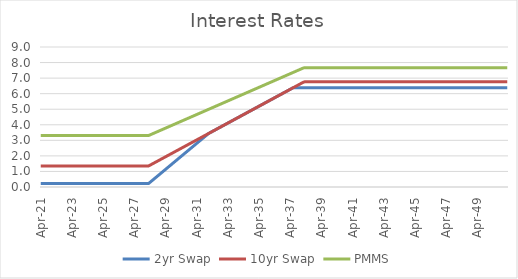
| Category | 2yr Swap | 10yr Swap | PMMS |
|---|---|---|---|
| 2021-04-30 | 0.223 | 1.352 | 3.308 |
| 2021-05-31 | 0.223 | 1.352 | 3.308 |
| 2021-06-30 | 0.223 | 1.352 | 3.308 |
| 2021-07-31 | 0.223 | 1.352 | 3.308 |
| 2021-08-31 | 0.223 | 1.352 | 3.308 |
| 2021-09-30 | 0.223 | 1.352 | 3.308 |
| 2021-10-31 | 0.223 | 1.352 | 3.308 |
| 2021-11-30 | 0.223 | 1.352 | 3.308 |
| 2021-12-31 | 0.223 | 1.352 | 3.308 |
| 2022-01-31 | 0.223 | 1.352 | 3.308 |
| 2022-02-28 | 0.223 | 1.352 | 3.308 |
| 2022-03-31 | 0.223 | 1.352 | 3.308 |
| 2022-04-30 | 0.223 | 1.352 | 3.308 |
| 2022-05-31 | 0.223 | 1.352 | 3.308 |
| 2022-06-30 | 0.223 | 1.352 | 3.308 |
| 2022-07-31 | 0.223 | 1.352 | 3.308 |
| 2022-08-31 | 0.223 | 1.352 | 3.308 |
| 2022-09-30 | 0.223 | 1.352 | 3.308 |
| 2022-10-31 | 0.223 | 1.352 | 3.308 |
| 2022-11-30 | 0.223 | 1.352 | 3.308 |
| 2022-12-31 | 0.223 | 1.352 | 3.308 |
| 2023-01-31 | 0.223 | 1.352 | 3.308 |
| 2023-02-28 | 0.223 | 1.352 | 3.308 |
| 2023-03-31 | 0.223 | 1.352 | 3.308 |
| 2023-04-30 | 0.223 | 1.352 | 3.308 |
| 2023-05-31 | 0.223 | 1.352 | 3.308 |
| 2023-06-30 | 0.223 | 1.352 | 3.308 |
| 2023-07-31 | 0.223 | 1.352 | 3.308 |
| 2023-08-31 | 0.223 | 1.352 | 3.308 |
| 2023-09-30 | 0.223 | 1.352 | 3.308 |
| 2023-10-31 | 0.223 | 1.352 | 3.308 |
| 2023-11-30 | 0.223 | 1.352 | 3.308 |
| 2023-12-31 | 0.223 | 1.352 | 3.308 |
| 2024-01-31 | 0.223 | 1.352 | 3.308 |
| 2024-02-29 | 0.223 | 1.352 | 3.308 |
| 2024-03-31 | 0.223 | 1.352 | 3.308 |
| 2024-04-30 | 0.223 | 1.352 | 3.308 |
| 2024-05-31 | 0.223 | 1.352 | 3.308 |
| 2024-06-30 | 0.223 | 1.352 | 3.308 |
| 2024-07-31 | 0.223 | 1.352 | 3.308 |
| 2024-08-31 | 0.223 | 1.352 | 3.308 |
| 2024-09-30 | 0.223 | 1.352 | 3.308 |
| 2024-10-31 | 0.223 | 1.352 | 3.308 |
| 2024-11-30 | 0.223 | 1.352 | 3.308 |
| 2024-12-31 | 0.223 | 1.352 | 3.308 |
| 2025-01-31 | 0.223 | 1.352 | 3.308 |
| 2025-02-28 | 0.223 | 1.352 | 3.308 |
| 2025-03-31 | 0.223 | 1.352 | 3.308 |
| 2025-04-30 | 0.223 | 1.352 | 3.308 |
| 2025-05-31 | 0.223 | 1.352 | 3.308 |
| 2025-06-30 | 0.223 | 1.352 | 3.308 |
| 2025-07-31 | 0.223 | 1.352 | 3.308 |
| 2025-08-31 | 0.223 | 1.352 | 3.308 |
| 2025-09-30 | 0.223 | 1.352 | 3.308 |
| 2025-10-31 | 0.223 | 1.352 | 3.308 |
| 2025-11-30 | 0.223 | 1.352 | 3.308 |
| 2025-12-31 | 0.223 | 1.352 | 3.308 |
| 2026-01-31 | 0.223 | 1.352 | 3.308 |
| 2026-02-28 | 0.223 | 1.352 | 3.308 |
| 2026-03-31 | 0.223 | 1.352 | 3.308 |
| 2026-04-30 | 0.223 | 1.352 | 3.308 |
| 2026-05-31 | 0.223 | 1.352 | 3.308 |
| 2026-06-30 | 0.223 | 1.352 | 3.308 |
| 2026-07-31 | 0.223 | 1.352 | 3.308 |
| 2026-08-31 | 0.223 | 1.352 | 3.308 |
| 2026-09-30 | 0.223 | 1.352 | 3.308 |
| 2026-10-31 | 0.223 | 1.352 | 3.308 |
| 2026-11-30 | 0.223 | 1.352 | 3.308 |
| 2026-12-31 | 0.223 | 1.352 | 3.308 |
| 2027-01-31 | 0.223 | 1.352 | 3.308 |
| 2027-02-28 | 0.223 | 1.352 | 3.308 |
| 2027-03-31 | 0.223 | 1.352 | 3.308 |
| 2027-04-30 | 0.223 | 1.352 | 3.308 |
| 2027-05-31 | 0.223 | 1.352 | 3.308 |
| 2027-06-30 | 0.223 | 1.352 | 3.308 |
| 2027-07-31 | 0.223 | 1.352 | 3.308 |
| 2027-08-31 | 0.223 | 1.352 | 3.308 |
| 2027-09-30 | 0.223 | 1.352 | 3.308 |
| 2027-10-31 | 0.223 | 1.352 | 3.308 |
| 2027-11-30 | 0.223 | 1.352 | 3.308 |
| 2027-12-31 | 0.223 | 1.352 | 3.308 |
| 2028-01-31 | 0.223 | 1.352 | 3.308 |
| 2028-02-29 | 0.223 | 1.352 | 3.308 |
| 2028-03-31 | 0.223 | 1.352 | 3.308 |
| 2028-04-30 | 0.292 | 1.397 | 3.345 |
| 2028-05-31 | 0.362 | 1.442 | 3.381 |
| 2028-06-30 | 0.432 | 1.487 | 3.417 |
| 2028-07-31 | 0.501 | 1.532 | 3.454 |
| 2028-08-31 | 0.571 | 1.578 | 3.49 |
| 2028-09-30 | 0.641 | 1.623 | 3.527 |
| 2028-10-31 | 0.71 | 1.668 | 3.563 |
| 2028-11-30 | 0.78 | 1.713 | 3.6 |
| 2028-12-31 | 0.85 | 1.759 | 3.636 |
| 2029-01-31 | 0.919 | 1.804 | 3.673 |
| 2029-02-28 | 0.989 | 1.849 | 3.709 |
| 2029-03-31 | 1.059 | 1.894 | 3.746 |
| 2029-04-30 | 1.128 | 1.939 | 3.782 |
| 2029-05-31 | 1.198 | 1.985 | 3.819 |
| 2029-06-30 | 1.268 | 2.03 | 3.855 |
| 2029-07-31 | 1.337 | 2.075 | 3.892 |
| 2029-08-31 | 1.407 | 2.12 | 3.928 |
| 2029-09-30 | 1.477 | 2.166 | 3.965 |
| 2029-10-31 | 1.546 | 2.211 | 4.001 |
| 2029-11-30 | 1.616 | 2.256 | 4.038 |
| 2029-12-31 | 1.686 | 2.301 | 4.074 |
| 2030-01-31 | 1.755 | 2.346 | 4.111 |
| 2030-02-28 | 1.825 | 2.392 | 4.147 |
| 2030-03-31 | 1.895 | 2.437 | 4.184 |
| 2030-04-30 | 1.964 | 2.482 | 4.22 |
| 2030-05-31 | 2.034 | 2.527 | 4.257 |
| 2030-06-30 | 2.104 | 2.573 | 4.293 |
| 2030-07-31 | 2.173 | 2.618 | 4.329 |
| 2030-08-31 | 2.243 | 2.663 | 4.366 |
| 2030-09-30 | 2.313 | 2.708 | 4.402 |
| 2030-10-31 | 2.382 | 2.753 | 4.439 |
| 2030-11-30 | 2.452 | 2.799 | 4.475 |
| 2030-12-31 | 2.522 | 2.844 | 4.512 |
| 2031-01-31 | 2.591 | 2.889 | 4.548 |
| 2031-02-28 | 2.661 | 2.934 | 4.585 |
| 2031-03-31 | 2.731 | 2.98 | 4.621 |
| 2031-04-30 | 2.8 | 3.025 | 4.658 |
| 2031-05-31 | 2.87 | 3.07 | 4.694 |
| 2031-06-30 | 2.94 | 3.115 | 4.731 |
| 2031-07-31 | 3.009 | 3.16 | 4.767 |
| 2031-08-31 | 3.079 | 3.206 | 4.804 |
| 2031-09-30 | 3.149 | 3.251 | 4.84 |
| 2031-10-31 | 3.218 | 3.296 | 4.877 |
| 2031-11-30 | 3.288 | 3.341 | 4.913 |
| 2031-12-31 | 3.358 | 3.386 | 4.95 |
| 2032-01-31 | 3.427 | 3.432 | 4.986 |
| 2032-02-29 | 3.477 | 3.477 | 5.023 |
| 2032-03-31 | 3.522 | 3.522 | 5.059 |
| 2032-04-30 | 3.567 | 3.567 | 5.096 |
| 2032-05-31 | 3.613 | 3.613 | 5.132 |
| 2032-06-30 | 3.658 | 3.658 | 5.168 |
| 2032-07-31 | 3.703 | 3.703 | 5.205 |
| 2032-08-31 | 3.748 | 3.748 | 5.241 |
| 2032-09-30 | 3.793 | 3.793 | 5.278 |
| 2032-10-31 | 3.839 | 3.839 | 5.314 |
| 2032-11-30 | 3.884 | 3.884 | 5.351 |
| 2032-12-31 | 3.929 | 3.929 | 5.387 |
| 2033-01-31 | 3.974 | 3.974 | 5.424 |
| 2033-02-28 | 4.02 | 4.02 | 5.46 |
| 2033-03-31 | 4.065 | 4.065 | 5.497 |
| 2033-04-30 | 4.11 | 4.11 | 5.533 |
| 2033-05-31 | 4.155 | 4.155 | 5.57 |
| 2033-06-30 | 4.2 | 4.2 | 5.606 |
| 2033-07-31 | 4.246 | 4.246 | 5.642 |
| 2033-08-31 | 4.291 | 4.291 | 5.679 |
| 2033-09-30 | 4.336 | 4.336 | 5.715 |
| 2033-10-31 | 4.381 | 4.381 | 5.752 |
| 2033-11-30 | 4.427 | 4.427 | 5.788 |
| 2033-12-31 | 4.472 | 4.472 | 5.825 |
| 2034-01-31 | 4.517 | 4.517 | 5.861 |
| 2034-02-28 | 4.562 | 4.562 | 5.898 |
| 2034-03-31 | 4.607 | 4.607 | 5.934 |
| 2034-04-30 | 4.653 | 4.653 | 5.971 |
| 2034-05-31 | 4.698 | 4.698 | 6.007 |
| 2034-06-30 | 4.743 | 4.743 | 6.044 |
| 2034-07-31 | 4.788 | 4.788 | 6.08 |
| 2034-08-31 | 4.834 | 4.834 | 6.116 |
| 2034-09-30 | 4.879 | 4.879 | 6.153 |
| 2034-10-31 | 4.924 | 4.924 | 6.189 |
| 2034-11-30 | 4.969 | 4.969 | 6.226 |
| 2034-12-31 | 5.014 | 5.014 | 6.262 |
| 2035-01-31 | 5.06 | 5.06 | 6.299 |
| 2035-02-28 | 5.105 | 5.105 | 6.335 |
| 2035-03-31 | 5.15 | 5.15 | 6.372 |
| 2035-04-30 | 5.195 | 5.195 | 6.408 |
| 2035-05-31 | 5.241 | 5.241 | 6.445 |
| 2035-06-30 | 5.286 | 5.286 | 6.481 |
| 2035-07-31 | 5.331 | 5.331 | 6.518 |
| 2035-08-31 | 5.376 | 5.376 | 6.554 |
| 2035-09-30 | 5.421 | 5.421 | 6.59 |
| 2035-10-31 | 5.467 | 5.467 | 6.627 |
| 2035-11-30 | 5.512 | 5.512 | 6.663 |
| 2035-12-31 | 5.557 | 5.557 | 6.7 |
| 2036-01-31 | 5.602 | 5.602 | 6.736 |
| 2036-02-29 | 5.648 | 5.648 | 6.773 |
| 2036-03-31 | 5.693 | 5.693 | 6.809 |
| 2036-04-30 | 5.738 | 5.738 | 6.846 |
| 2036-05-31 | 5.783 | 5.783 | 6.882 |
| 2036-06-30 | 5.828 | 5.828 | 6.919 |
| 2036-07-31 | 5.874 | 5.874 | 6.955 |
| 2036-08-31 | 5.919 | 5.919 | 6.992 |
| 2036-09-30 | 5.964 | 5.964 | 7.028 |
| 2036-10-31 | 6.009 | 6.009 | 7.064 |
| 2036-11-30 | 6.055 | 6.055 | 7.101 |
| 2036-12-31 | 6.1 | 6.1 | 7.137 |
| 2037-01-31 | 6.145 | 6.145 | 7.174 |
| 2037-02-28 | 6.19 | 6.19 | 7.21 |
| 2037-03-31 | 6.235 | 6.235 | 7.247 |
| 2037-04-30 | 6.281 | 6.281 | 7.283 |
| 2037-05-31 | 6.326 | 6.326 | 7.32 |
| 2037-06-30 | 6.371 | 6.371 | 7.356 |
| 2037-07-31 | 6.387 | 6.416 | 7.393 |
| 2037-08-31 | 6.387 | 6.461 | 7.429 |
| 2037-09-30 | 6.387 | 6.507 | 7.465 |
| 2037-10-31 | 6.387 | 6.552 | 7.502 |
| 2037-11-30 | 6.387 | 6.597 | 7.538 |
| 2037-12-31 | 6.387 | 6.642 | 7.575 |
| 2038-01-31 | 6.387 | 6.688 | 7.611 |
| 2038-02-28 | 6.387 | 6.733 | 7.648 |
| 2038-03-31 | 6.387 | 6.758 | 7.668 |
| 2038-04-30 | 6.387 | 6.758 | 7.668 |
| 2038-05-31 | 6.387 | 6.758 | 7.668 |
| 2038-06-30 | 6.387 | 6.758 | 7.668 |
| 2038-07-31 | 6.387 | 6.758 | 7.668 |
| 2038-08-31 | 6.387 | 6.758 | 7.668 |
| 2038-09-30 | 6.387 | 6.758 | 7.668 |
| 2038-10-31 | 6.387 | 6.758 | 7.668 |
| 2038-11-30 | 6.387 | 6.758 | 7.668 |
| 2038-12-31 | 6.387 | 6.758 | 7.668 |
| 2039-01-31 | 6.387 | 6.758 | 7.668 |
| 2039-02-28 | 6.387 | 6.758 | 7.668 |
| 2039-03-31 | 6.387 | 6.758 | 7.668 |
| 2039-04-30 | 6.387 | 6.758 | 7.668 |
| 2039-05-31 | 6.387 | 6.758 | 7.668 |
| 2039-06-30 | 6.387 | 6.758 | 7.668 |
| 2039-07-31 | 6.387 | 6.758 | 7.668 |
| 2039-08-31 | 6.387 | 6.758 | 7.668 |
| 2039-09-30 | 6.387 | 6.758 | 7.668 |
| 2039-10-31 | 6.387 | 6.758 | 7.668 |
| 2039-11-30 | 6.387 | 6.758 | 7.668 |
| 2039-12-31 | 6.387 | 6.758 | 7.668 |
| 2040-01-31 | 6.387 | 6.758 | 7.668 |
| 2040-02-29 | 6.387 | 6.758 | 7.668 |
| 2040-03-31 | 6.387 | 6.758 | 7.668 |
| 2040-04-30 | 6.387 | 6.758 | 7.668 |
| 2040-05-31 | 6.387 | 6.758 | 7.668 |
| 2040-06-30 | 6.387 | 6.758 | 7.668 |
| 2040-07-31 | 6.387 | 6.758 | 7.668 |
| 2040-08-31 | 6.387 | 6.758 | 7.668 |
| 2040-09-30 | 6.387 | 6.758 | 7.668 |
| 2040-10-31 | 6.387 | 6.758 | 7.668 |
| 2040-11-30 | 6.387 | 6.758 | 7.668 |
| 2040-12-31 | 6.387 | 6.758 | 7.668 |
| 2041-01-31 | 6.387 | 6.758 | 7.668 |
| 2041-02-28 | 6.387 | 6.758 | 7.668 |
| 2041-03-31 | 6.387 | 6.758 | 7.668 |
| 2041-04-30 | 6.387 | 6.758 | 7.668 |
| 2041-05-31 | 6.387 | 6.758 | 7.668 |
| 2041-06-30 | 6.387 | 6.758 | 7.668 |
| 2041-07-31 | 6.387 | 6.758 | 7.668 |
| 2041-08-31 | 6.387 | 6.758 | 7.668 |
| 2041-09-30 | 6.387 | 6.758 | 7.668 |
| 2041-10-31 | 6.387 | 6.758 | 7.668 |
| 2041-11-30 | 6.387 | 6.758 | 7.668 |
| 2041-12-31 | 6.387 | 6.758 | 7.668 |
| 2042-01-31 | 6.387 | 6.758 | 7.668 |
| 2042-02-28 | 6.387 | 6.758 | 7.668 |
| 2042-03-31 | 6.387 | 6.758 | 7.668 |
| 2042-04-30 | 6.387 | 6.758 | 7.668 |
| 2042-05-31 | 6.387 | 6.758 | 7.668 |
| 2042-06-30 | 6.387 | 6.758 | 7.668 |
| 2042-07-31 | 6.387 | 6.758 | 7.668 |
| 2042-08-31 | 6.387 | 6.758 | 7.668 |
| 2042-09-30 | 6.387 | 6.758 | 7.668 |
| 2042-10-31 | 6.387 | 6.758 | 7.668 |
| 2042-11-30 | 6.387 | 6.758 | 7.668 |
| 2042-12-31 | 6.387 | 6.758 | 7.668 |
| 2043-01-31 | 6.387 | 6.758 | 7.668 |
| 2043-02-28 | 6.387 | 6.758 | 7.668 |
| 2043-03-31 | 6.387 | 6.758 | 7.668 |
| 2043-04-30 | 6.387 | 6.758 | 7.668 |
| 2043-05-31 | 6.387 | 6.758 | 7.668 |
| 2043-06-30 | 6.387 | 6.758 | 7.668 |
| 2043-07-31 | 6.387 | 6.758 | 7.668 |
| 2043-08-31 | 6.387 | 6.758 | 7.668 |
| 2043-09-30 | 6.387 | 6.758 | 7.668 |
| 2043-10-31 | 6.387 | 6.758 | 7.668 |
| 2043-11-30 | 6.387 | 6.758 | 7.668 |
| 2043-12-31 | 6.387 | 6.758 | 7.668 |
| 2044-01-31 | 6.387 | 6.758 | 7.668 |
| 2044-02-29 | 6.387 | 6.758 | 7.668 |
| 2044-03-31 | 6.387 | 6.758 | 7.668 |
| 2044-04-30 | 6.387 | 6.758 | 7.668 |
| 2044-05-31 | 6.387 | 6.758 | 7.668 |
| 2044-06-30 | 6.387 | 6.758 | 7.668 |
| 2044-07-31 | 6.387 | 6.758 | 7.668 |
| 2044-08-31 | 6.387 | 6.758 | 7.668 |
| 2044-09-30 | 6.387 | 6.758 | 7.668 |
| 2044-10-31 | 6.387 | 6.758 | 7.668 |
| 2044-11-30 | 6.387 | 6.758 | 7.668 |
| 2044-12-31 | 6.387 | 6.758 | 7.668 |
| 2045-01-31 | 6.387 | 6.758 | 7.668 |
| 2045-02-28 | 6.387 | 6.758 | 7.668 |
| 2045-03-31 | 6.387 | 6.758 | 7.668 |
| 2045-04-30 | 6.387 | 6.758 | 7.668 |
| 2045-05-31 | 6.387 | 6.758 | 7.668 |
| 2045-06-30 | 6.387 | 6.758 | 7.668 |
| 2045-07-31 | 6.387 | 6.758 | 7.668 |
| 2045-08-31 | 6.387 | 6.758 | 7.668 |
| 2045-09-30 | 6.387 | 6.758 | 7.668 |
| 2045-10-31 | 6.387 | 6.758 | 7.668 |
| 2045-11-30 | 6.387 | 6.758 | 7.668 |
| 2045-12-31 | 6.387 | 6.758 | 7.668 |
| 2046-01-31 | 6.387 | 6.758 | 7.668 |
| 2046-02-28 | 6.387 | 6.758 | 7.668 |
| 2046-03-31 | 6.387 | 6.758 | 7.668 |
| 2046-04-30 | 6.387 | 6.758 | 7.668 |
| 2046-05-31 | 6.387 | 6.758 | 7.668 |
| 2046-06-30 | 6.387 | 6.758 | 7.668 |
| 2046-07-31 | 6.387 | 6.758 | 7.668 |
| 2046-08-31 | 6.387 | 6.758 | 7.668 |
| 2046-09-30 | 6.387 | 6.758 | 7.668 |
| 2046-10-31 | 6.387 | 6.758 | 7.668 |
| 2046-11-30 | 6.387 | 6.758 | 7.668 |
| 2046-12-31 | 6.387 | 6.758 | 7.668 |
| 2047-01-31 | 6.387 | 6.758 | 7.668 |
| 2047-02-28 | 6.387 | 6.758 | 7.668 |
| 2047-03-31 | 6.387 | 6.758 | 7.668 |
| 2047-04-30 | 6.387 | 6.758 | 7.668 |
| 2047-05-31 | 6.387 | 6.758 | 7.668 |
| 2047-06-30 | 6.387 | 6.758 | 7.668 |
| 2047-07-31 | 6.387 | 6.758 | 7.668 |
| 2047-08-31 | 6.387 | 6.758 | 7.668 |
| 2047-09-30 | 6.387 | 6.758 | 7.668 |
| 2047-10-31 | 6.387 | 6.758 | 7.668 |
| 2047-11-30 | 6.387 | 6.758 | 7.668 |
| 2047-12-31 | 6.387 | 6.758 | 7.668 |
| 2048-01-31 | 6.387 | 6.758 | 7.668 |
| 2048-02-29 | 6.387 | 6.758 | 7.668 |
| 2048-03-31 | 6.387 | 6.758 | 7.668 |
| 2048-04-30 | 6.387 | 6.758 | 7.668 |
| 2048-05-31 | 6.387 | 6.758 | 7.668 |
| 2048-06-30 | 6.387 | 6.758 | 7.668 |
| 2048-07-31 | 6.387 | 6.758 | 7.668 |
| 2048-08-31 | 6.387 | 6.758 | 7.668 |
| 2048-09-30 | 6.387 | 6.758 | 7.668 |
| 2048-10-31 | 6.387 | 6.758 | 7.668 |
| 2048-11-30 | 6.387 | 6.758 | 7.668 |
| 2048-12-31 | 6.387 | 6.758 | 7.668 |
| 2049-01-31 | 6.387 | 6.758 | 7.668 |
| 2049-02-28 | 6.387 | 6.758 | 7.668 |
| 2049-03-31 | 6.387 | 6.758 | 7.668 |
| 2049-04-30 | 6.387 | 6.758 | 7.668 |
| 2049-05-31 | 6.387 | 6.758 | 7.668 |
| 2049-06-30 | 6.387 | 6.758 | 7.668 |
| 2049-07-31 | 6.387 | 6.758 | 7.668 |
| 2049-08-31 | 6.387 | 6.758 | 7.668 |
| 2049-09-30 | 6.387 | 6.758 | 7.668 |
| 2049-10-31 | 6.387 | 6.758 | 7.668 |
| 2049-11-30 | 6.387 | 6.758 | 7.668 |
| 2049-12-31 | 6.387 | 6.758 | 7.668 |
| 2050-01-31 | 6.387 | 6.758 | 7.668 |
| 2050-02-28 | 6.387 | 6.758 | 7.668 |
| 2050-03-31 | 6.387 | 6.758 | 7.668 |
| 2050-04-30 | 6.387 | 6.758 | 7.668 |
| 2050-05-31 | 6.387 | 6.758 | 7.668 |
| 2050-06-30 | 6.387 | 6.758 | 7.668 |
| 2050-07-31 | 6.387 | 6.758 | 7.668 |
| 2050-08-31 | 6.387 | 6.758 | 7.668 |
| 2050-09-30 | 6.387 | 6.758 | 7.668 |
| 2050-10-31 | 6.387 | 6.758 | 7.668 |
| 2050-11-30 | 6.387 | 6.758 | 7.668 |
| 2050-12-31 | 6.387 | 6.758 | 7.668 |
| 2051-01-31 | 6.387 | 6.758 | 7.668 |
| 2051-02-28 | 6.387 | 6.758 | 7.668 |
| 2051-03-31 | 6.387 | 6.758 | 7.668 |